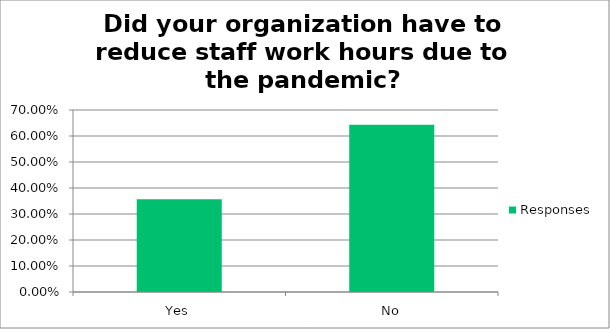
| Category | Responses |
|---|---|
| Yes | 0.357 |
| No | 0.643 |